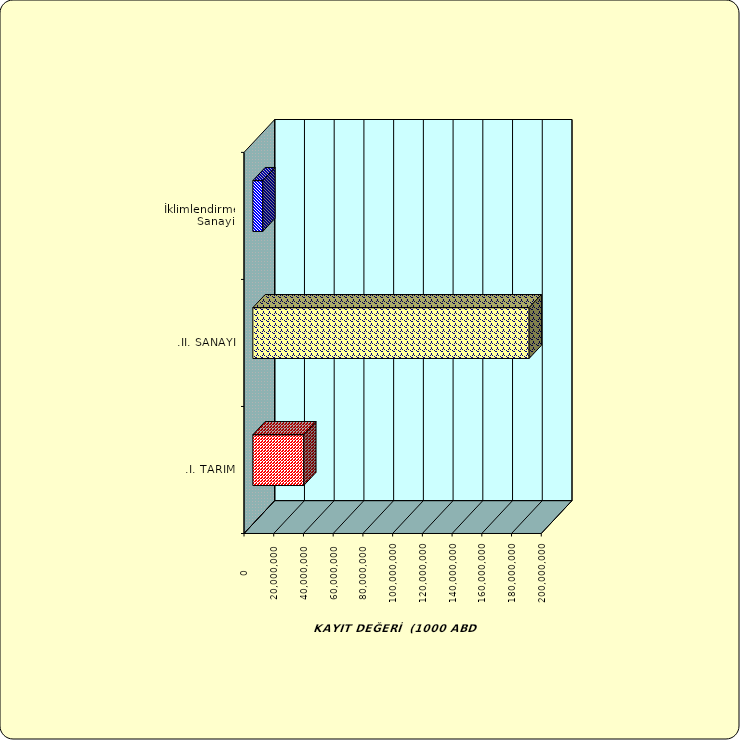
| Category | Series 0 |
|---|---|
| .I. TARIM | 34246491.992 |
| .II. SANAYİ | 185880772.038 |
|  İklimlendirme Sanayii | 6680529.881 |